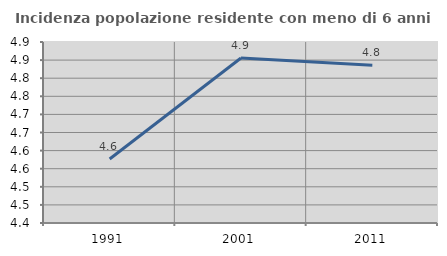
| Category | Incidenza popolazione residente con meno di 6 anni |
|---|---|
| 1991.0 | 4.577 |
| 2001.0 | 4.856 |
| 2011.0 | 4.835 |